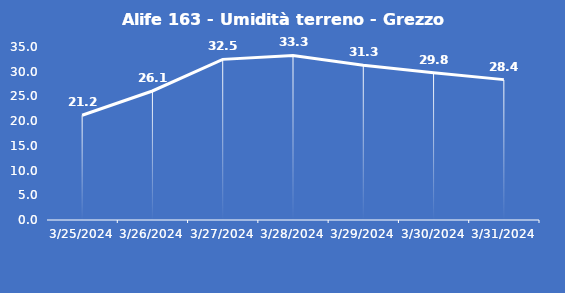
| Category | Alife 163 - Umidità terreno - Grezzo (%VWC) |
|---|---|
| 3/25/24 | 21.2 |
| 3/26/24 | 26.1 |
| 3/27/24 | 32.5 |
| 3/28/24 | 33.3 |
| 3/29/24 | 31.3 |
| 3/30/24 | 29.8 |
| 3/31/24 | 28.4 |